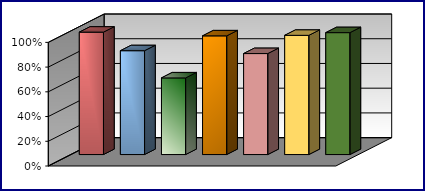
| Category | Series 0 | Series 1 | Series 2 | Series 3 |
|---|---|---|---|---|
| 0 | 0.99 |  |  |  |
| 1 | 0.84 |  |  |  |
| 2 | 0.62 |  |  |  |
| 3 | 0.96 |  |  |  |
| 4 | 0.817 |  |  |  |
| 5 | 0.964 |  |  |  |
| 6 | 0.986 |  |  |  |